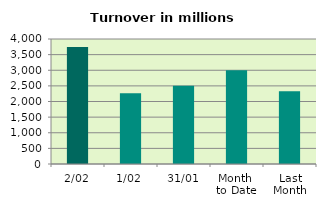
| Category | Series 0 |
|---|---|
| 2/02 | 3746.685 |
| 1/02 | 2260.896 |
| 31/01 | 2507.664 |
| Month 
to Date | 3003.79 |
| Last
Month | 2326.675 |